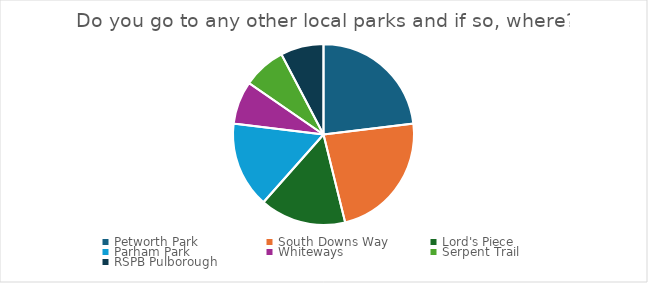
| Category | Series 0 |
|---|---|
| Petworth Park | 3 |
| South Downs Way | 3 |
| Lord's Piece | 2 |
| Parham Park | 2 |
| Whiteways | 1 |
| Serpent Trail | 1 |
| RSPB Pulborough | 1 |